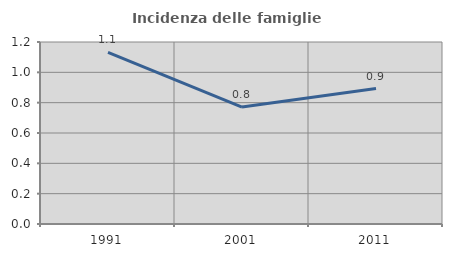
| Category | Incidenza delle famiglie numerose |
|---|---|
| 1991.0 | 1.131 |
| 2001.0 | 0.771 |
| 2011.0 | 0.893 |